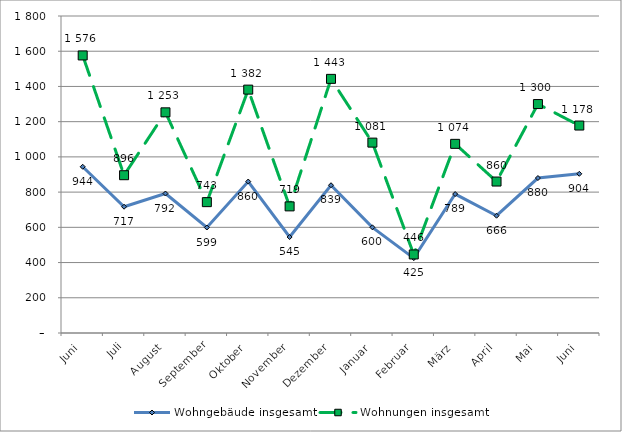
| Category | Wohngebäude insgesamt | Wohnungen insgesamt |
|---|---|---|
| Juni | 944 | 1576 |
| Juli | 717 | 896 |
| August | 792 | 1253 |
| September | 599 | 743 |
| Oktober | 860 | 1382 |
| November | 545 | 719 |
| Dezember | 839 | 1443 |
| Januar | 600 | 1081 |
| Februar | 425 | 446 |
| März | 789 | 1074 |
| April | 666 | 860 |
| Mai | 880 | 1300 |
| Juni | 904 | 1178 |